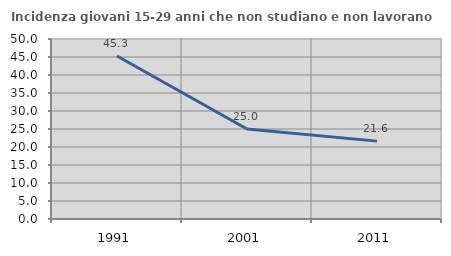
| Category | Incidenza giovani 15-29 anni che non studiano e non lavorano  |
|---|---|
| 1991.0 | 45.263 |
| 2001.0 | 25 |
| 2011.0 | 21.634 |